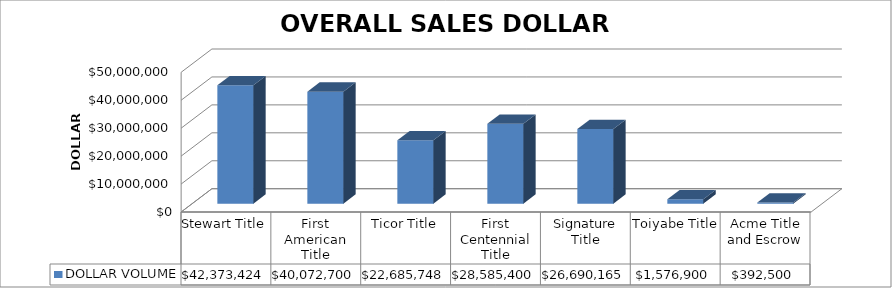
| Category | DOLLAR VOLUME |
|---|---|
| Stewart Title | 42373424 |
| First American Title | 40072700 |
| Ticor Title | 22685747.73 |
| First Centennial Title | 28585400 |
| Signature Title | 26690165 |
| Toiyabe Title | 1576900 |
| Acme Title and Escrow | 392500 |